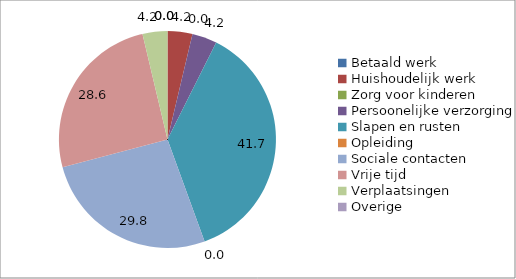
| Category | Series 0 |
|---|---|
| Betaald werk | 0 |
| Huishoudelijk werk | 4.167 |
| Zorg voor kinderen | 0 |
| Persoonelijke verzorging | 4.167 |
| Slapen en rusten | 41.667 |
| Opleiding | 0 |
| Sociale contacten | 29.762 |
| Vrije tijd | 28.571 |
| Verplaatsingen | 4.167 |
| Overige | 0 |